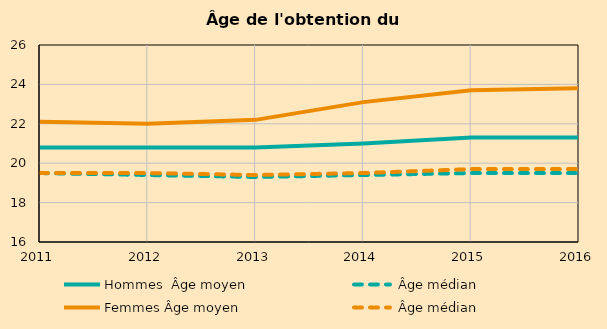
| Category | Hommes  Âge moyen | Hommes  Âge médian | Femmes Âge moyen | Femmes Âge médian |
|---|---|---|---|---|
| 2011.0 | 20.8 | 19.5 | 22.1 | 19.5 |
| 2012.0 | 20.8 | 19.4 | 22 | 19.5 |
| 2013.0 | 20.8 | 19.3 | 22.2 | 19.4 |
| 2014.0 | 21 | 19.4 | 23.1 | 19.5 |
| 2015.0 | 21.3 | 19.5 | 23.7 | 19.7 |
| 2016.0 | 21.3 | 19.5 | 23.8 | 19.7 |